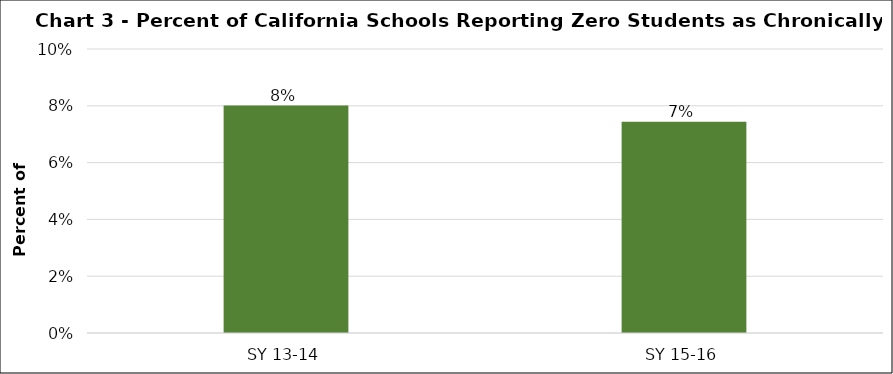
| Category | Series 0 |
|---|---|
| SY 13-14 | 0.08 |
| SY 15-16 | 0.074 |